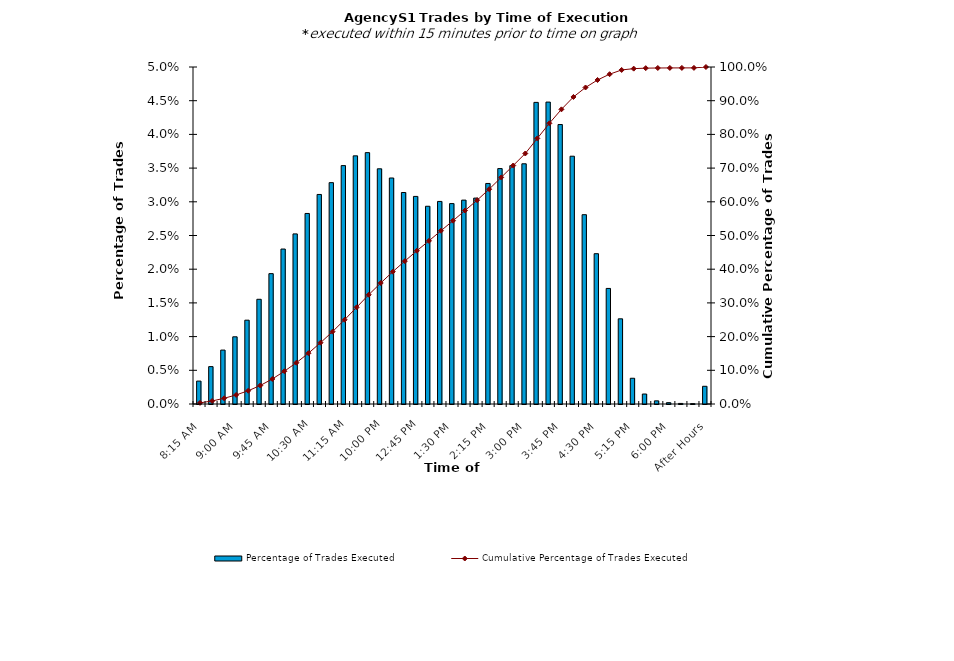
| Category | Percentage of Trades Executed |
|---|---|
| 8:15 AM | 0.003 |
| 8:30 AM | 0.006 |
| 8:45 AM | 0.008 |
| 9:00 AM | 0.01 |
| 9:15 AM | 0.012 |
| 9:30 AM | 0.016 |
| 9:45 AM | 0.019 |
| 10:00 AM | 0.023 |
| 10:15 AM | 0.025 |
| 10:30 AM | 0.028 |
| 10:45 AM | 0.031 |
| 11:00 AM | 0.033 |
| 11:15 AM | 0.035 |
| 11:30 AM | 0.037 |
| 11:45 AM | 0.037 |
| 12:00 PM | 0.035 |
| 12:15 PM | 0.034 |
| 12:30 PM | 0.031 |
| 12:45 PM | 0.031 |
| 1:00 PM | 0.029 |
| 1:15 PM | 0.03 |
| 1:30 PM | 0.03 |
| 1:45 PM | 0.03 |
| 2:00 PM | 0.031 |
| 2:15 PM | 0.033 |
| 2:30 PM | 0.035 |
| 2:45 PM | 0.035 |
| 3:00 PM | 0.036 |
| 3:15 PM | 0.045 |
| 3:30 PM | 0.045 |
| 3:45 PM | 0.041 |
| 4:00 PM | 0.037 |
| 4:15 PM | 0.028 |
| 4:30 PM | 0.022 |
| 4:45 PM | 0.017 |
| 5:00 PM | 0.013 |
| 5:15 PM | 0.004 |
| 5:30 PM | 0.001 |
| 5:45 PM | 0 |
| 6:00 PM | 0 |
| 6:15 PM | 0 |
| 6:30 PM | 0 |
| After Hours | 0.003 |